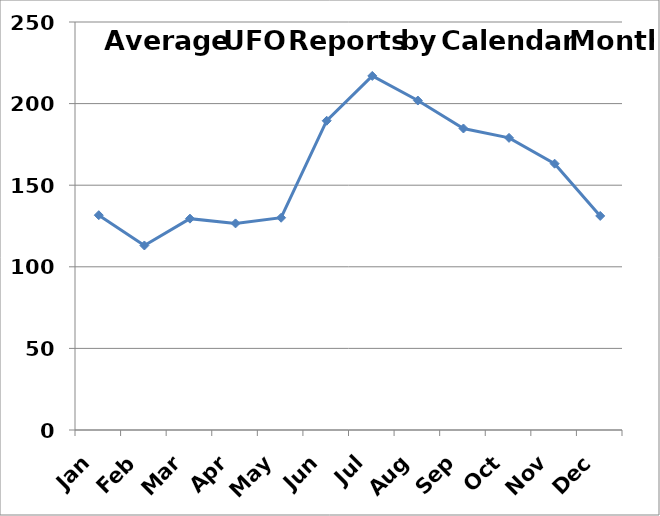
| Category | Series 0 |
|---|---|
| Jan | 131.625 |
| Feb | 113.062 |
| Mar | 129.5 |
| Apr | 126.594 |
| May | 130.062 |
| Jun | 189.5 |
| Jul | 216.969 |
| Aug | 201.875 |
| Sep | 184.75 |
| Oct | 179 |
| Nov | 163.188 |
| Dec | 131.156 |